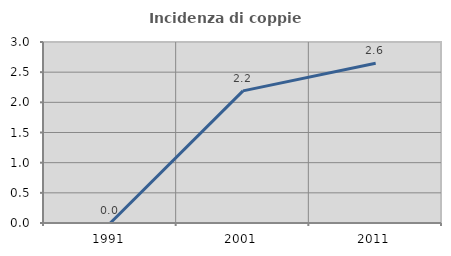
| Category | Incidenza di coppie miste |
|---|---|
| 1991.0 | 0 |
| 2001.0 | 2.19 |
| 2011.0 | 2.649 |